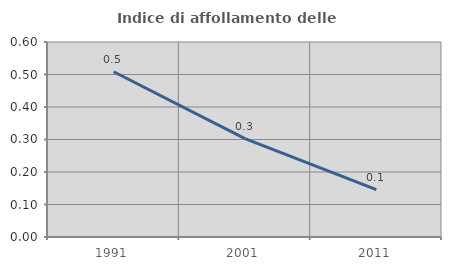
| Category | Indice di affollamento delle abitazioni  |
|---|---|
| 1991.0 | 0.508 |
| 2001.0 | 0.303 |
| 2011.0 | 0.146 |